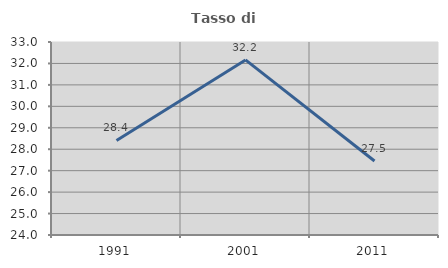
| Category | Tasso di occupazione   |
|---|---|
| 1991.0 | 28.409 |
| 2001.0 | 32.164 |
| 2011.0 | 27.451 |